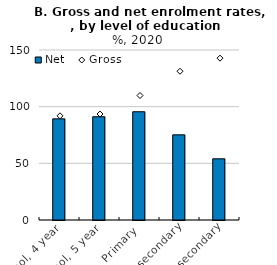
| Category | Net |
|---|---|
| Preschool, 4 year | 89.25 |
| Preschool, 5 year | 91.115 |
| Primary | 95.521 |
| Lower secondary | 75.128 |
| Upper secondary | 54.001 |